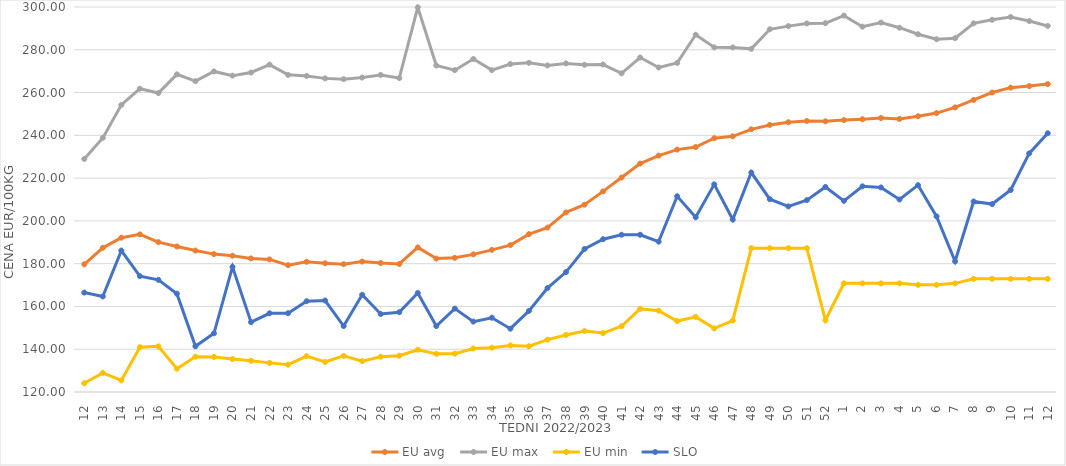
| Category | EU avg | EU max | EU min | SLO |
|---|---|---|---|---|
| 12.0 | 179.714 | 228.97 | 124.105 | 166.49 |
| 13.0 | 187.409 | 238.81 | 128.918 | 164.66 |
| 14.0 | 192.137 | 254.21 | 125.399 | 186.11 |
| 15.0 | 193.697 | 261.79 | 140.954 | 174.18 |
| 16.0 | 190.066 | 259.76 | 141.337 | 172.42 |
| 17.0 | 188.031 | 268.52 | 130.897 | 165.96 |
| 18.0 | 186.119 | 265.34 | 136.529 | 141.36 |
| 19.0 | 184.47 | 269.87 | 136.387 | 147.43 |
| 20.0 | 183.734 | 267.92 | 135.392 | 178.51 |
| 21.0 | 182.45 | 269.38 | 134.589 | 152.67 |
| 22.0 | 181.991 | 273.06 | 133.621 | 156.8 |
| 23.0 | 179.308 | 268.27 | 132.787 | 156.84 |
| 24.0 | 180.886 | 267.77 | 136.75 | 162.44 |
| 25.0 | 180.2 | 266.63 | 134.058 | 162.78 |
| 26.0 | 179.77 | 266.27 | 136.895 | 150.82 |
| 27.0 | 180.992 | 267.02 | 134.44 | 165.45 |
| 28.0 | 180.305 | 268.25 | 136.486 | 156.46 |
| 29.0 | 179.847 | 266.77 | 136.97 | 157.31 |
| 30.0 | 187.576 | 299.87 | 139.777 | 166.29 |
| 31.0 | 182.385 | 272.64 | 137.828 | 150.81 |
| 32.0 | 182.73 | 270.47 | 137.934 | 158.99 |
| 33.0 | 184.343 | 275.68 | 140.33 | 152.91 |
| 34.0 | 186.448 | 270.49 | 140.7 | 154.73 |
| 35.0 | 188.684 | 273.33 | 141.78 | 149.6 |
| 36.0 | 193.792 | 273.91 | 141.41 | 157.93 |
| 37.0 | 196.877 | 272.67 | 144.47 | 168.61 |
| 38.0 | 203.962 | 273.63 | 146.68 | 176.07 |
| 39.0 | 207.574 | 272.98 | 148.499 | 186.86 |
| 40.0 | 213.785 | 273.1 | 147.54 | 191.45 |
| 41.0 | 220.272 | 268.98 | 150.75 | 193.52 |
| 42.0 | 226.803 | 276.39 | 158.87 | 193.52 |
| 43.0 | 230.521 | 271.72 | 158.04 | 190.28 |
| 44.0 | 233.325 | 273.856 | 153.16 | 211.53 |
| 45.0 | 234.517 | 287.021 | 155.13 | 201.69 |
| 46.0 | 238.669 | 281.133 | 149.75 | 217.08 |
| 47.0 | 239.534 | 281.102 | 153.36 | 200.62 |
| 48.0 | 242.81 | 280.434 | 187.26 | 222.61 |
| 49.0 | 244.854 | 289.585 | 187.26 | 210.16 |
| 50.0 | 246.132 | 291.057 | 187.26 | 206.76 |
| 51.0 | 246.705 | 292.307 | 187.26 | 209.69 |
| 52.0 | 246.546 | 292.426 | 153.54 | 215.87 |
| 1.0 | 247.118 | 295.98 | 170.79 | 209.37 |
| 2.0 | 247.516 | 290.8 | 170.79 | 216.15 |
| 3.0 | 248.079 | 292.71 | 170.79 | 215.63 |
| 4.0 | 247.672 | 290.32 | 170.79 | 210 |
| 5.0 | 248.924 | 287.27 | 170.09 | 216.7 |
| 6.0 | 250.4 | 284.92 | 170.09 | 202.1 |
| 7.0 | 253.074 | 285.42 | 170.79 | 181.11 |
| 8.0 | 256.543 | 292.35 | 172.91 | 209.08 |
| 9.0 | 260.003 | 294.02 | 172.91 | 207.87 |
| 10.0 | 262.288 | 295.33 | 172.91 | 214.42 |
| 11.0 | 263.026 | 293.44 | 172.91 | 231.56 |
| 12.0 | 263.954 | 291.15 | 172.91 | 240.97 |